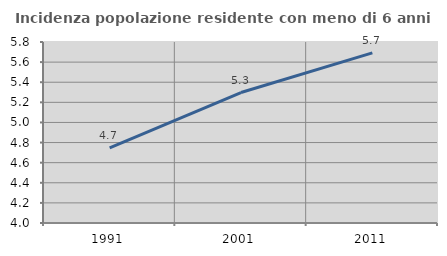
| Category | Incidenza popolazione residente con meno di 6 anni |
|---|---|
| 1991.0 | 4.747 |
| 2001.0 | 5.297 |
| 2011.0 | 5.692 |